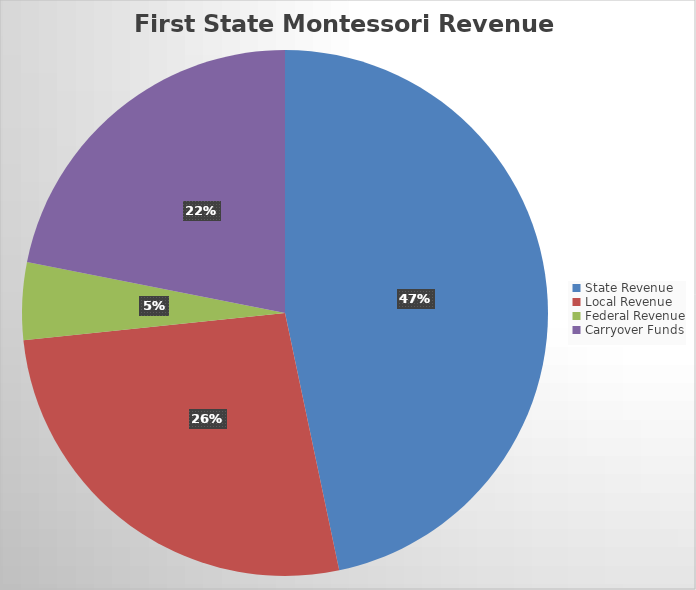
| Category | Series 0 |
|---|---|
| State Revenue | 5231292.36 |
| Local Revenue | 2985731.37 |
| Federal Revenue | 533879 |
| Carryover Funds | 2452130.34 |